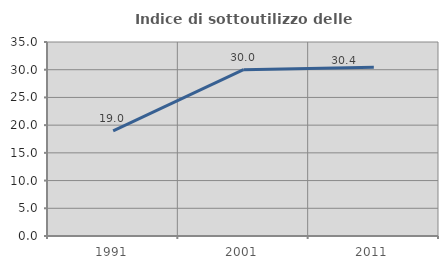
| Category | Indice di sottoutilizzo delle abitazioni  |
|---|---|
| 1991.0 | 18.97 |
| 2001.0 | 30 |
| 2011.0 | 30.428 |